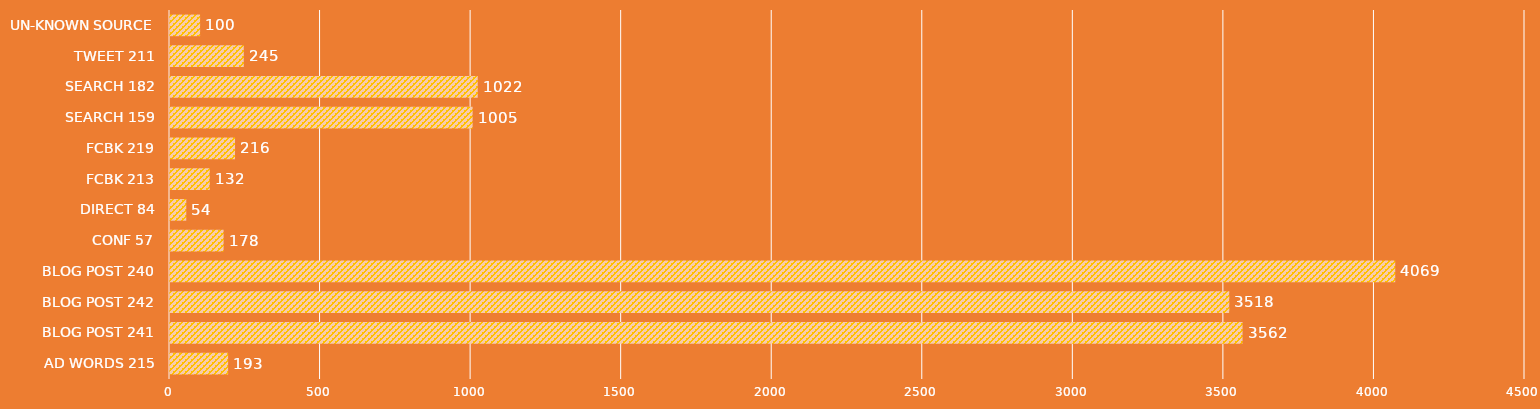
| Category | Series 0 |
|---|---|
| AD WORDS 215 | 193 |
| BLOG POST 241 | 3562 |
| BLOG POST 242 | 3518 |
| BLOG POST 240 | 4069 |
| CONF 57 | 178 |
| DIRECT 84 | 54 |
| FCBK 213 | 132 |
| FCBK 219 | 216 |
| SEARCH 159 | 1005 |
| SEARCH 182 | 1022 |
| TWEET 211 | 245 |
| UN-KNOWN SOURCE | 100 |